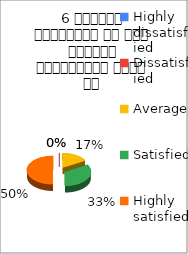
| Category | 6 शिक्षक समयनिष्ट है एवं नियमित व्याख्यान देते है  |
|---|---|
| Highly dissatisfied | 0 |
| Dissatisfied | 0 |
| Average | 1 |
| Satisfied | 2 |
| Highly satisfied | 3 |